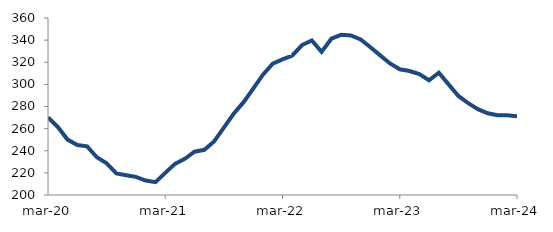
| Category | Series 0 |
|---|---|
| 2020-03-01 | 270.182 |
| 2020-04-01 | 261.514 |
| 2020-05-01 | 250.092 |
| 2020-06-01 | 245.154 |
| 2020-07-01 | 243.995 |
| 2020-08-01 | 234.063 |
| 2020-09-01 | 228.636 |
| 2020-10-01 | 219.498 |
| 2020-11-01 | 217.84 |
| 2020-12-01 | 216.368 |
| 2021-01-01 | 213.087 |
| 2021-02-01 | 211.643 |
| 2021-03-01 | 220.04 |
| 2021-04-01 | 228.12 |
| 2021-05-01 | 232.717 |
| 2021-06-01 | 239.097 |
| 2021-07-01 | 240.846 |
| 2021-08-01 | 248.449 |
| 2021-09-01 | 260.934 |
| 2021-10-01 | 273.441 |
| 2021-11-01 | 283.683 |
| 2021-12-01 | 296.134 |
| 2022-01-01 | 308.804 |
| 2022-02-01 | 318.726 |
| 2022-03-01 | 322.592 |
| 2022-04-01 | 326.114 |
| 2022-05-01 | 335.557 |
| 2022-06-01 | 339.684 |
| 2022-07-01 | 329.357 |
| 2022-08-01 | 341.293 |
| 2022-09-01 | 344.793 |
| 2022-10-01 | 344.185 |
| 2022-11-01 | 340.608 |
| 2022-12-01 | 333.559 |
| 2023-01-01 | 326.199 |
| 2023-02-01 | 318.915 |
| 2023-03-01 | 313.615 |
| 2023-04-01 | 312.076 |
| 2023-05-01 | 309.232 |
| 2023-06-01 | 303.714 |
| 2023-07-01 | 310.493 |
| 2023-08-01 | 299.987 |
| 2023-09-01 | 289.543 |
| 2023-10-01 | 283.093 |
| 2023-11-01 | 277.645 |
| 2023-12-01 | 273.863 |
| 2024-01-01 | 272.122 |
| 2024-02-01 | 272.092 |
| 2024-03-01 | 271.115 |